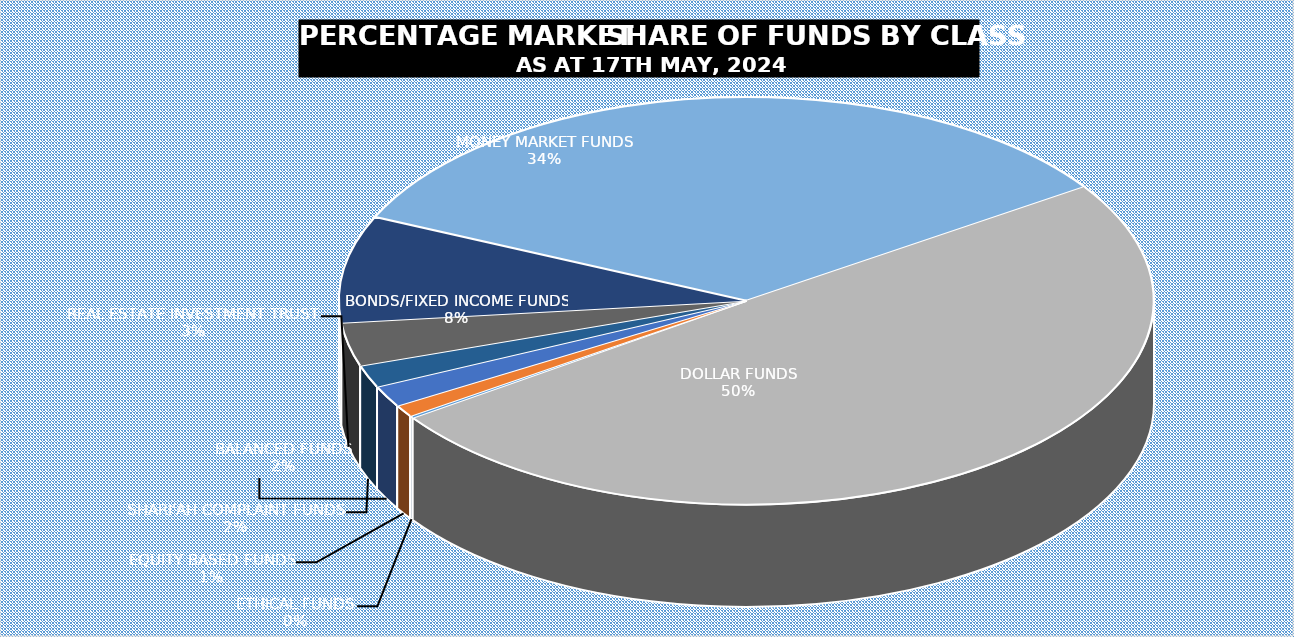
| Category | 17-May |
|---|---|
| ETHICAL FUNDS | 4791752838.15 |
| EQUITY BASED FUNDS | 27187812730.464 |
| BALANCED FUNDS | 48528341927.034 |
| SHARI'AH COMPLAINT FUNDS | 51188420633.276 |
| REAL ESTATE INVESTMENT TRUST | 99095338201.224 |
| BONDS/FIXED INCOME FUNDS | 244017171187.902 |
| MONEY MARKET FUNDS | 974788648500.336 |
| DOLLAR FUNDS | 1433100293468.586 |